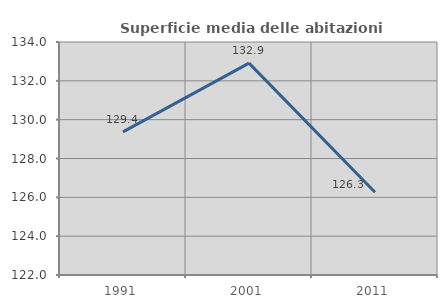
| Category | Superficie media delle abitazioni occupate |
|---|---|
| 1991.0 | 129.371 |
| 2001.0 | 132.913 |
| 2011.0 | 126.258 |